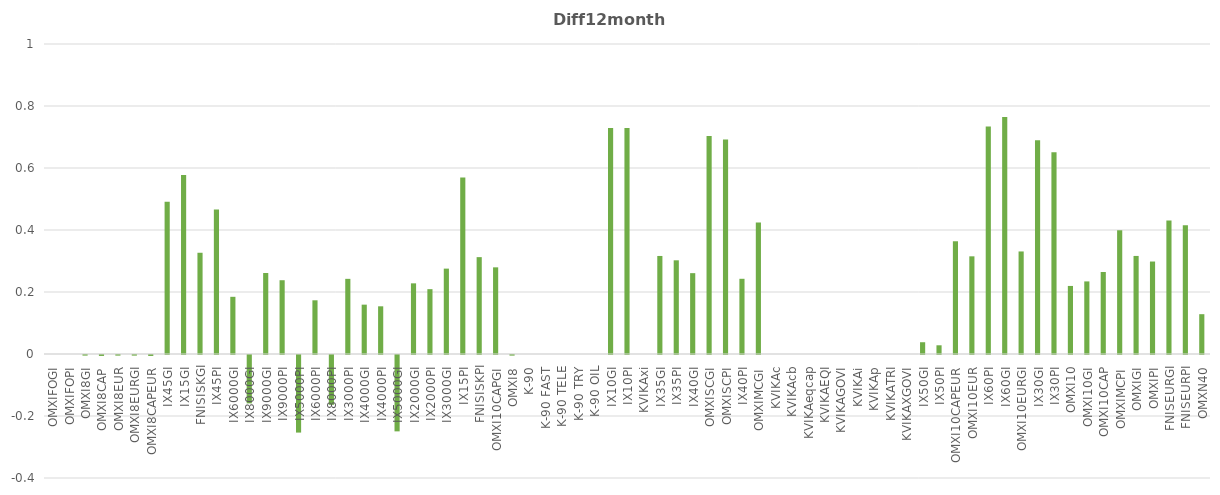
| Category | Diff12months |
|---|---|
| OMXIFOGI | 0 |
| OMXIFOPI | 0 |
| OMXI8GI | -0.002 |
| OMXI8CAP | -0.003 |
| OMXI8EUR | -0.002 |
| OMXI8EURGI | -0.002 |
| OMXI8CAPEUR | -0.003 |
| IX45GI | 0.491 |
| IX15GI | 0.577 |
| FNISISKGI | 0.327 |
| IX45PI | 0.466 |
| IX6000GI | 0.184 |
| IX8000GI | -0.156 |
| IX9000GI | 0.261 |
| IX9000PI | 0.238 |
| IX5000PI | -0.25 |
| IX6000PI | 0.173 |
| IX8000PI | -0.161 |
| IX3000PI | 0.242 |
| IX4000GI | 0.159 |
| IX4000PI | 0.154 |
| IX5000GI | -0.246 |
| IX2000GI | 0.228 |
| IX2000PI | 0.209 |
| IX3000GI | 0.275 |
| IX15PI | 0.569 |
| FNISISKPI | 0.312 |
| OMXI10CAPGI | 0.28 |
| OMXI8 | -0.002 |
| K-90 | 0 |
| K-90 FAST | 0 |
| K-90 TELE | 0 |
| K-90 TRY | 0 |
| K-90 OIL | 0 |
| IX10GI | 0.729 |
| IX10PI | 0.729 |
| KVIKAxi | 0 |
| IX35GI | 0.316 |
| IX35PI | 0.302 |
| IX40GI | 0.261 |
| OMXISCGI | 0.704 |
| OMXISCPI | 0.692 |
| IX40PI | 0.243 |
| OMXIMCGI | 0.424 |
| KVIKAc | 0 |
| KVIKAcb | 0 |
| KVIKAeqcap | 0 |
| KVIKAEQI | 0 |
| KVIKAGOVI | 0 |
| KVIKAi | 0 |
| KVIKAp | 0 |
| KVIKATRI | 0 |
| KVIKAXGOVI | 0 |
| IX50GI | 0.038 |
| IX50PI | 0.028 |
| OMXI10CAPEUR | 0.364 |
| OMXI10EUR | 0.315 |
| IX60PI | 0.734 |
| IX60GI | 0.764 |
| OMXI10EURGI | 0.331 |
| IX30GI | 0.69 |
| IX30PI | 0.651 |
| OMXI10 | 0.22 |
| OMXI10GI | 0.234 |
| OMXI10CAP | 0.265 |
| OMXIMCPI | 0.399 |
| OMXIGI | 0.316 |
| OMXIPI | 0.298 |
| FNISEURGI | 0.43 |
| FNISEURPI | 0.415 |
| OMXN40 | 0.128 |